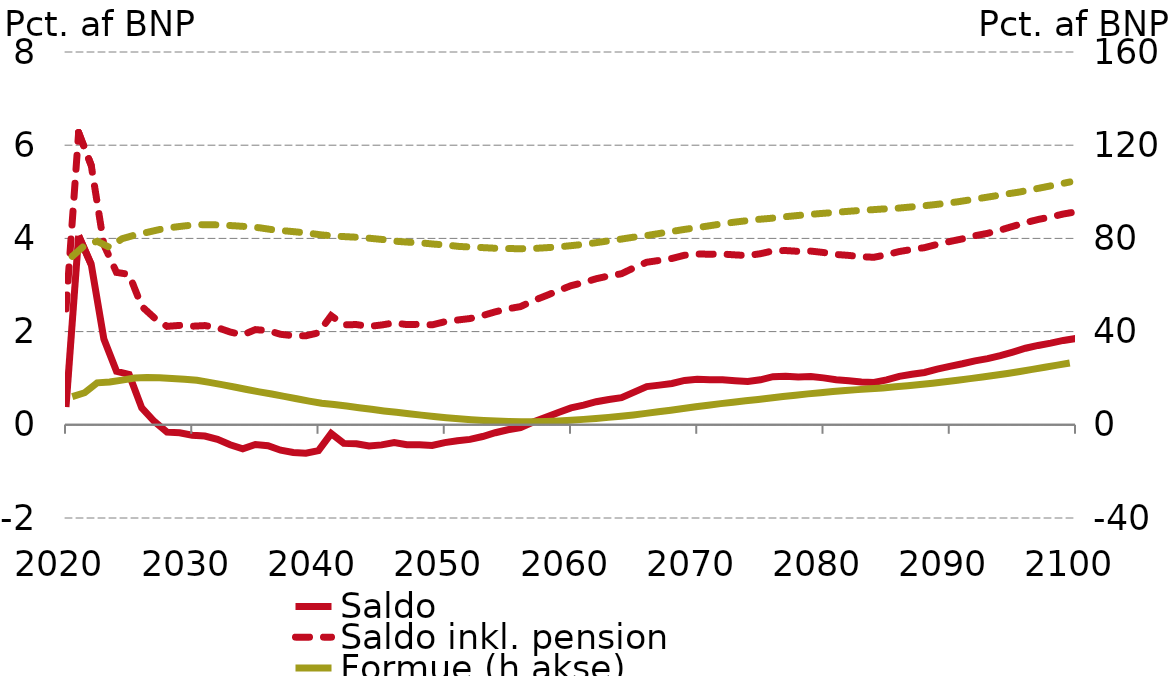
| Category |  Saldo |  Saldo inkl. pension |
|---|---|---|
| 0 | 0.38 | 2.488 |
| 1 | 4.057 | 6.271 |
| 2 | 3.44 | 5.567 |
| 3 | 1.84 | 3.862 |
| 4 | 1.147 | 3.27 |
| 5 | 1.081 | 3.228 |
| 6 | 0.362 | 2.542 |
| 7 | 0.07 | 2.294 |
| 8 | -0.158 | 2.112 |
| 9 | -0.171 | 2.133 |
| 10 | -0.223 | 2.115 |
| 11 | -0.241 | 2.129 |
| 12 | -0.311 | 2.085 |
| 13 | -0.429 | 1.991 |
| 14 | -0.517 | 1.929 |
| 15 | -0.422 | 2.043 |
| 16 | -0.449 | 2.021 |
| 17 | -0.545 | 1.942 |
| 18 | -0.594 | 1.912 |
| 19 | -0.61 | 1.91 |
| 20 | -0.555 | 1.974 |
| 21 | -0.188 | 2.342 |
| 22 | -0.399 | 2.145 |
| 23 | -0.407 | 2.151 |
| 24 | -0.456 | 2.111 |
| 25 | -0.431 | 2.142 |
| 26 | -0.382 | 2.187 |
| 27 | -0.426 | 2.15 |
| 28 | -0.43 | 2.157 |
| 29 | -0.445 | 2.145 |
| 30 | -0.383 | 2.211 |
| 31 | -0.341 | 2.248 |
| 32 | -0.312 | 2.28 |
| 33 | -0.252 | 2.344 |
| 34 | -0.171 | 2.424 |
| 35 | -0.107 | 2.489 |
| 36 | -0.062 | 2.536 |
| 37 | 0.06 | 2.662 |
| 38 | 0.159 | 2.768 |
| 39 | 0.265 | 2.879 |
| 40 | 0.363 | 2.985 |
| 41 | 0.424 | 3.052 |
| 42 | 0.495 | 3.135 |
| 43 | 0.544 | 3.195 |
| 44 | 0.581 | 3.242 |
| 45 | 0.702 | 3.372 |
| 46 | 0.819 | 3.489 |
| 47 | 0.852 | 3.528 |
| 48 | 0.887 | 3.57 |
| 49 | 0.952 | 3.639 |
| 50 | 0.976 | 3.665 |
| 51 | 0.969 | 3.661 |
| 52 | 0.966 | 3.664 |
| 53 | 0.944 | 3.646 |
| 54 | 0.928 | 3.632 |
| 55 | 0.965 | 3.671 |
| 56 | 1.033 | 3.732 |
| 57 | 1.041 | 3.739 |
| 58 | 1.026 | 3.722 |
| 59 | 1.034 | 3.727 |
| 60 | 1.007 | 3.697 |
| 61 | 0.968 | 3.655 |
| 62 | 0.947 | 3.635 |
| 63 | 0.917 | 3.606 |
| 64 | 0.907 | 3.595 |
| 65 | 0.964 | 3.651 |
| 66 | 1.038 | 3.718 |
| 67 | 1.083 | 3.763 |
| 68 | 1.123 | 3.801 |
| 69 | 1.193 | 3.872 |
| 70 | 1.254 | 3.933 |
| 71 | 1.31 | 3.99 |
| 72 | 1.372 | 4.057 |
| 73 | 1.42 | 4.109 |
| 74 | 1.486 | 4.178 |
| 75 | 1.562 | 4.259 |
| 76 | 1.643 | 4.339 |
| 77 | 1.703 | 4.406 |
| 78 | 1.752 | 4.46 |
| 79 | 1.811 | 4.524 |
| 80 | 1.852 | 4.571 |